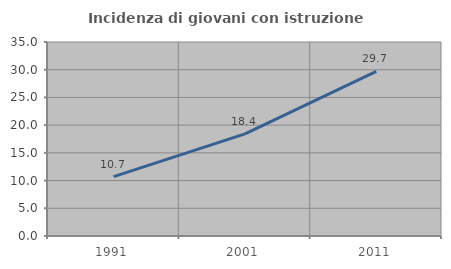
| Category | Incidenza di giovani con istruzione universitaria |
|---|---|
| 1991.0 | 10.722 |
| 2001.0 | 18.413 |
| 2011.0 | 29.718 |